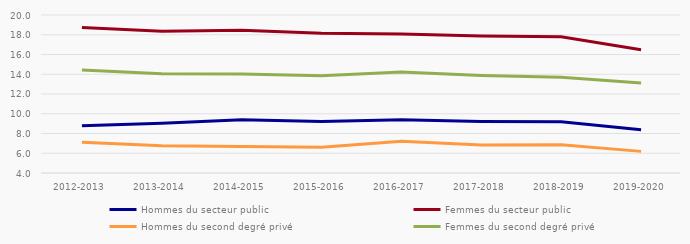
| Category | Hommes du secteur public | Femmes du secteur public | Hommes du second degré privé | Femmes du second degré privé |
|---|---|---|---|---|
| 2012-2013 | 8.78 | 18.74 | 7.12 | 14.43 |
| 2013-2014 | 9.05 | 18.35 | 6.75 | 14.04 |
| 2014-2015 | 9.4 | 18.45 | 6.68 | 14.02 |
| 2015-2016 | 9.22 | 18.14 | 6.61 | 13.85 |
| 2016-2017 | 9.38 | 18.08 | 7.21 | 14.22 |
| 2017-2018 | 9.21 | 17.87 | 6.83 | 13.87 |
| 2018-2019 | 9.2 | 17.8 | 6.86 | 13.69 |
| 2019-2020 | 8.39 | 16.48 | 6.19 | 13.12 |